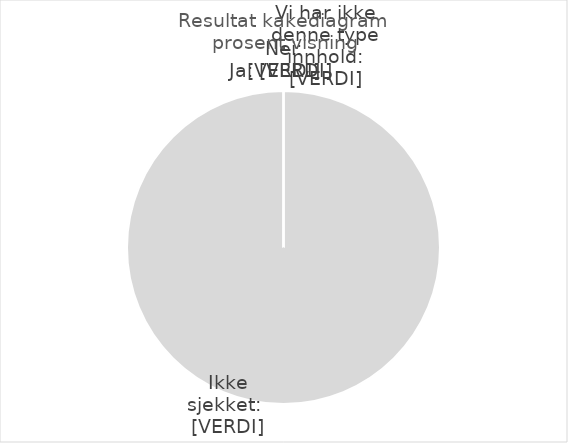
| Category | Series 0 |
|---|---|
| 0 | 0 |
| 1 | 0 |
| 2 | 0 |
| 3 | 1 |